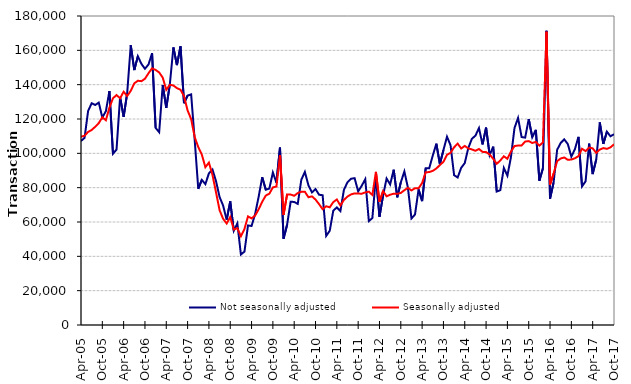
| Category | Not seasonally adjusted | Seasonally adjusted |
|---|---|---|
| 2005-04-01 | 107190 | 109680 |
| 2005-05-01 | 109010 | 110270 |
| 2005-06-01 | 124660 | 112460 |
| 2005-07-01 | 129170 | 113610 |
| 2005-08-01 | 128150 | 115470 |
| 2005-09-01 | 129560 | 117590 |
| 2005-10-01 | 120860 | 120990 |
| 2005-11-01 | 124540 | 119270 |
| 2005-12-01 | 136300 | 126640 |
| 2006-01-01 | 99740 | 132100 |
| 2006-02-01 | 102230 | 133940 |
| 2006-03-01 | 132710 | 132080 |
| 2006-04-01 | 121270 | 135880 |
| 2006-05-01 | 135030 | 133370 |
| 2006-06-01 | 162970 | 136400 |
| 2006-07-01 | 148490 | 140770 |
| 2006-08-01 | 156560 | 142280 |
| 2006-09-01 | 152100 | 142030 |
| 2006-10-01 | 149270 | 143440 |
| 2006-11-01 | 151770 | 146670 |
| 2006-12-01 | 158310 | 149510 |
| 2007-01-01 | 114880 | 148580 |
| 2007-02-01 | 112280 | 147120 |
| 2007-03-01 | 139780 | 144110 |
| 2007-04-01 | 126450 | 136980 |
| 2007-05-01 | 140110 | 139920 |
| 2007-06-01 | 161680 | 139530 |
| 2007-07-01 | 151390 | 137980 |
| 2007-08-01 | 162330 | 137040 |
| 2007-09-01 | 129210 | 133260 |
| 2007-10-01 | 133700 | 124980 |
| 2007-11-01 | 134320 | 119940 |
| 2007-12-01 | 107680 | 109440 |
| 2008-01-01 | 79350 | 103660 |
| 2008-02-01 | 84540 | 99300 |
| 2008-03-01 | 82050 | 91920 |
| 2008-04-01 | 88350 | 94610 |
| 2008-05-01 | 90570 | 87440 |
| 2008-06-01 | 83780 | 77280 |
| 2008-07-01 | 74560 | 66860 |
| 2008-08-01 | 69560 | 61820 |
| 2008-09-01 | 61330 | 59130 |
| 2008-10-01 | 72020 | 62890 |
| 2008-11-01 | 54910 | 55610 |
| 2008-12-01 | 59180 | 56400 |
| 2009-01-01 | 41060 | 51660 |
| 2009-02-01 | 42750 | 55930 |
| 2009-03-01 | 57990 | 63250 |
| 2009-04-01 | 57690 | 62120 |
| 2009-05-01 | 64640 | 63760 |
| 2009-06-01 | 74760 | 67390 |
| 2009-07-01 | 86090 | 71810 |
| 2009-08-01 | 78820 | 75400 |
| 2009-09-01 | 79480 | 76470 |
| 2009-10-01 | 88840 | 80170 |
| 2009-11-01 | 82910 | 80640 |
| 2009-12-01 | 103320 | 98940 |
| 2010-01-01 | 50230 | 64150 |
| 2010-02-01 | 58370 | 76080 |
| 2010-03-01 | 71830 | 76000 |
| 2010-04-01 | 71660 | 75260 |
| 2010-05-01 | 70560 | 76860 |
| 2010-06-01 | 84580 | 77610 |
| 2010-07-01 | 89190 | 77620 |
| 2010-08-01 | 81420 | 74440 |
| 2010-09-01 | 77250 | 74920 |
| 2010-10-01 | 79190 | 73070 |
| 2010-11-01 | 75890 | 70390 |
| 2010-12-01 | 75600 | 67470 |
| 2011-01-01 | 51900 | 69170 |
| 2011-02-01 | 54880 | 68550 |
| 2011-03-01 | 66600 | 71600 |
| 2011-04-01 | 68510 | 73110 |
| 2011-05-01 | 66340 | 69620 |
| 2011-06-01 | 78780 | 72890 |
| 2011-07-01 | 83180 | 74840 |
| 2011-08-01 | 85180 | 76080 |
| 2011-09-01 | 85530 | 76670 |
| 2011-10-01 | 77840 | 76570 |
| 2011-11-01 | 81110 | 76470 |
| 2011-12-01 | 84940 | 77250 |
| 2012-01-01 | 60530 | 77660 |
| 2012-02-01 | 62300 | 75760 |
| 2012-03-01 | 86720 | 89210 |
| 2012-04-01 | 63040 | 71720 |
| 2012-05-01 | 75350 | 78000 |
| 2012-06-01 | 85310 | 74980 |
| 2012-07-01 | 81880 | 75880 |
| 2012-08-01 | 90440 | 76490 |
| 2012-09-01 | 74390 | 76400 |
| 2012-10-01 | 83060 | 76910 |
| 2012-11-01 | 89450 | 78530 |
| 2012-12-01 | 80010 | 79890 |
| 2013-01-01 | 62060 | 78390 |
| 2013-02-01 | 64360 | 79700 |
| 2013-03-01 | 79000 | 79590 |
| 2013-04-01 | 72180 | 82680 |
| 2013-05-01 | 91270 | 88940 |
| 2013-06-01 | 91270 | 89090 |
| 2013-07-01 | 98710 | 89800 |
| 2013-08-01 | 105630 | 91180 |
| 2013-09-01 | 93680 | 93160 |
| 2013-10-01 | 101920 | 95090 |
| 2013-11-01 | 109670 | 99170 |
| 2013-12-01 | 104700 | 100280 |
| 2014-01-01 | 87280 | 103530 |
| 2014-02-01 | 85940 | 105660 |
| 2014-03-01 | 91570 | 102820 |
| 2014-04-01 | 94340 | 104320 |
| 2014-05-01 | 103110 | 102840 |
| 2014-06-01 | 108460 | 102290 |
| 2014-07-01 | 110280 | 101470 |
| 2014-08-01 | 114720 | 102510 |
| 2014-09-01 | 105170 | 100850 |
| 2014-10-01 | 114990 | 100730 |
| 2014-11-01 | 99010 | 99370 |
| 2014-12-01 | 103880 | 96810 |
| 2015-01-01 | 77750 | 93890 |
| 2015-02-01 | 78540 | 95850 |
| 2015-03-01 | 91490 | 98270 |
| 2015-04-01 | 86970 | 96800 |
| 2015-05-01 | 97800 | 101040 |
| 2015-06-01 | 114770 | 104260 |
| 2015-07-01 | 120610 | 104530 |
| 2015-08-01 | 109480 | 104580 |
| 2015-09-01 | 109160 | 106880 |
| 2015-10-01 | 119950 | 107110 |
| 2015-11-01 | 109370 | 106030 |
| 2015-12-01 | 113690 | 106670 |
| 2016-01-01 | 84030 | 104470 |
| 2016-02-01 | 91310 | 106390 |
| 2016-03-01 | 171370 | 170850 |
| 2016-04-01 | 73560 | 81720 |
| 2016-05-01 | 83000 | 88210 |
| 2016-06-01 | 102090 | 95470 |
| 2016-07-01 | 106040 | 97000 |
| 2016-08-01 | 108110 | 97580 |
| 2016-09-01 | 105400 | 96220 |
| 2016-10-01 | 98070 | 96400 |
| 2016-11-01 | 102440 | 97110 |
| 2016-12-01 | 109600 | 98380 |
| 2017-01-01 | 80710 | 102660 |
| 2017-02-01 | 83670 | 101300 |
| 2017-03-01 | 105640 | 103360 |
| 2017-04-01 | 87920 | 102910 |
| 2017-05-01 | 96410 | 100260 |
| 2017-06-01 | 118010 | 102180 |
| 2017-07-01 | 105480 | 103050 |
| 2017-08-01 | 112610 | 102600 |
| 2017-09-01 | 109930 | 103460 |
| 2017-10-01 | 111110 | 105260 |